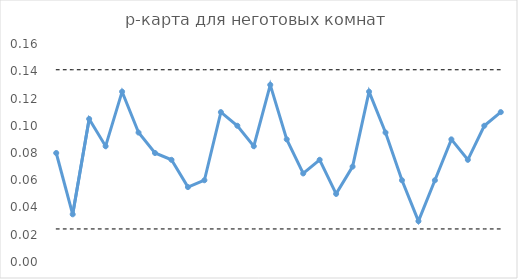
| Category | Доля | НКГ | ВКГ |
|---|---|---|---|
| 0 | 0.08 | 0.024 | 0.141 |
| 1 | 0.035 | 0.024 | 0.141 |
| 2 | 0.105 | 0.024 | 0.141 |
| 3 | 0.085 | 0.024 | 0.141 |
| 4 | 0.125 | 0.024 | 0.141 |
| 5 | 0.095 | 0.024 | 0.141 |
| 6 | 0.08 | 0.024 | 0.141 |
| 7 | 0.075 | 0.024 | 0.141 |
| 8 | 0.055 | 0.024 | 0.141 |
| 9 | 0.06 | 0.024 | 0.141 |
| 10 | 0.11 | 0.024 | 0.141 |
| 11 | 0.1 | 0.024 | 0.141 |
| 12 | 0.085 | 0.024 | 0.141 |
| 13 | 0.13 | 0.024 | 0.141 |
| 14 | 0.09 | 0.024 | 0.141 |
| 15 | 0.065 | 0.024 | 0.141 |
| 16 | 0.075 | 0.024 | 0.141 |
| 17 | 0.05 | 0.024 | 0.141 |
| 18 | 0.07 | 0.024 | 0.141 |
| 19 | 0.125 | 0.024 | 0.141 |
| 20 | 0.095 | 0.024 | 0.141 |
| 21 | 0.06 | 0.024 | 0.141 |
| 22 | 0.03 | 0.024 | 0.141 |
| 23 | 0.06 | 0.024 | 0.141 |
| 24 | 0.09 | 0.024 | 0.141 |
| 25 | 0.075 | 0.024 | 0.141 |
| 26 | 0.1 | 0.024 | 0.141 |
| 27 | 0.11 | 0.024 | 0.141 |